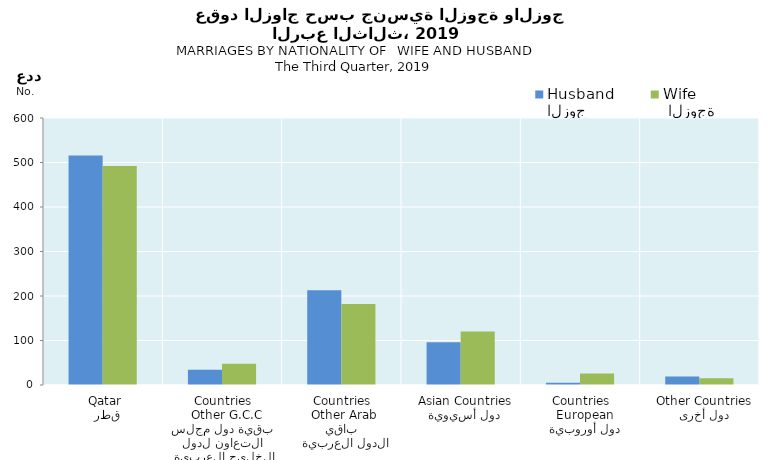
| Category | الزوج
Husband |  الزوجة
Wife |
|---|---|---|
|   قطر
 Qatar | 516 | 492 |
|  بقية دول مجلس التعاون لدول الخليج العربية
  Other G.C.C Countries | 34 | 48 |
|   باقي الدول العربية
 Other Arab Countries | 213 | 182 |
|   دول أسيوية
  Asian Countries | 96 | 120 |
|   دول أوروبية
  European Countries | 5 | 26 |
|   دول أخرى
  Other Countries | 19 | 15 |